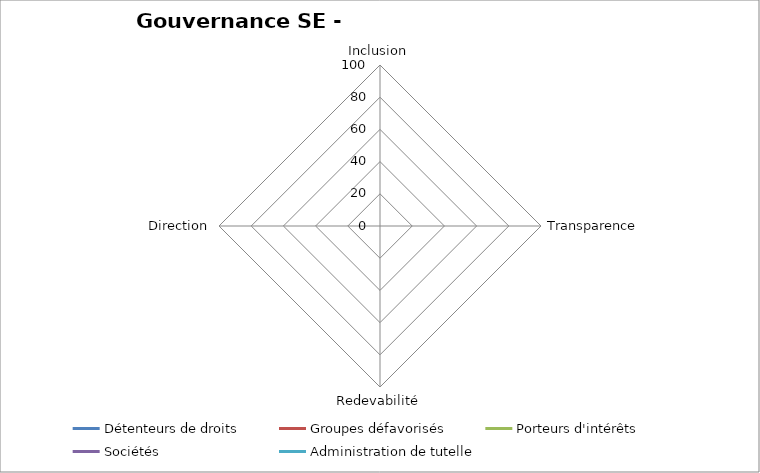
| Category | Détenteurs de droits | Groupes défavorisés | Porteurs d'intérêts | Sociétés | Administration de tutelle |
|---|---|---|---|---|---|
| Inclusion | 0 | 0 | 0 | 0 | 0 |
| Transparence | 0 | 0 | 0 | 0 | 0 |
| Redevabilité | 0 | 0 | 0 | 0 | 0 |
| Direction | 0 | 0 | 0 | 0 | 0 |